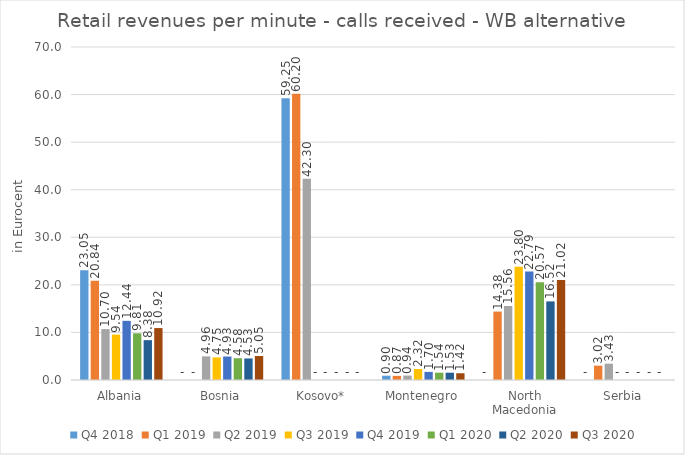
| Category | Q4 2018 | Q1 2019 | Q2 2019 | Q3 2019 | Q4 2019 | Q1 2020 | Q2 2020 | Q3 2020 |
|---|---|---|---|---|---|---|---|---|
| Albania | 23.046 | 20.84 | 10.699 | 9.545 | 12.436 | 9.809 | 8.378 | 10.916 |
| Bosnia | 0 | 0 | 4.964 | 4.748 | 4.935 | 4.575 | 4.527 | 5.047 |
| Kosovo* | 59.248 | 60.199 | 42.304 | 0 | 0 | 0 | 0 | 0 |
| Montenegro | 0.903 | 0.873 | 0.936 | 2.317 | 1.705 | 1.536 | 1.535 | 1.418 |
| North Macedonia | 0 | 14.385 | 15.556 | 23.804 | 22.792 | 20.566 | 16.523 | 21.018 |
| Serbia | 0 | 3.018 | 3.434 | 0 | 0 | 0 | 0 | 0 |